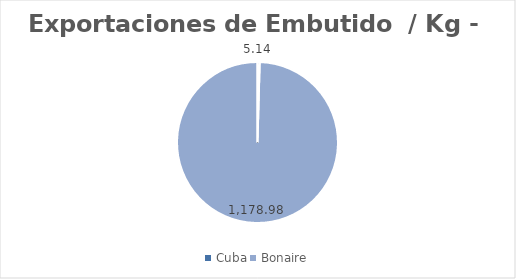
| Category | kg |
|---|---|
| Cuba | 5.139 |
| Bonaire | 1178.98 |